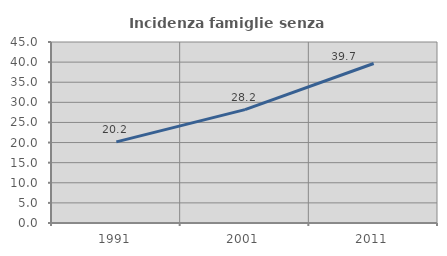
| Category | Incidenza famiglie senza nuclei |
|---|---|
| 1991.0 | 20.174 |
| 2001.0 | 28.179 |
| 2011.0 | 39.661 |